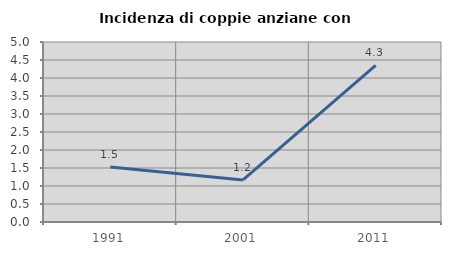
| Category | Incidenza di coppie anziane con figli |
|---|---|
| 1991.0 | 1.527 |
| 2001.0 | 1.167 |
| 2011.0 | 4.348 |